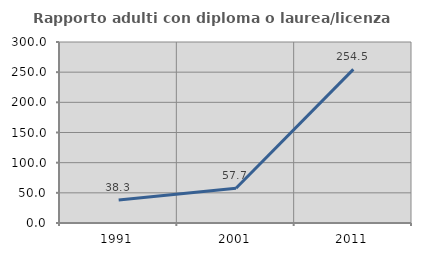
| Category | Rapporto adulti con diploma o laurea/licenza media  |
|---|---|
| 1991.0 | 38.298 |
| 2001.0 | 57.676 |
| 2011.0 | 254.545 |